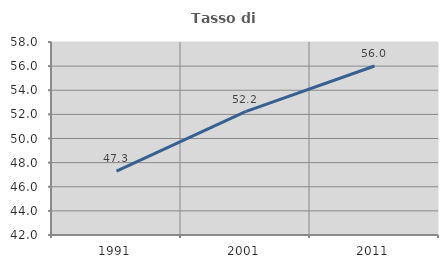
| Category | Tasso di occupazione   |
|---|---|
| 1991.0 | 47.296 |
| 2001.0 | 52.229 |
| 2011.0 | 56.013 |